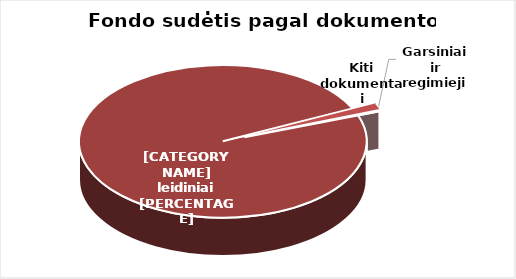
| Category | Series 0 |
|---|---|
| Knygos ir serialiniai | 1976335 |
| Garsiniai ir regimieji | 28510 |
| Kiti dokumentai | 2724 |